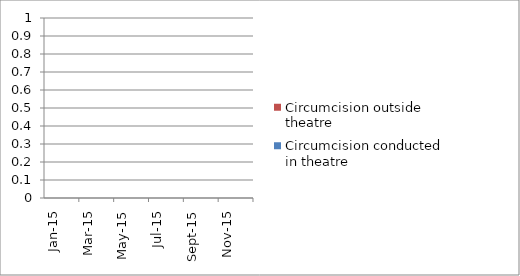
| Category | Circumcision conducted in theatre | Circumcision outside theatre |
|---|---|---|
| 2015-01-01 | 0 | 0 |
| 2015-02-01 | 0 | 0 |
| 2015-03-01 | 0 | 0 |
| 2015-04-01 | 0 | 0 |
| 2015-05-01 | 0 | 0 |
| 2015-06-01 | 0 | 0 |
| 2015-07-01 | 0 | 0 |
| 2015-08-01 | 0 | 0 |
| 2015-09-01 | 0 | 0 |
| 2015-10-01 | 0 | 0 |
| 2015-11-01 | 0 | 0 |
| 2015-12-01 | 0 | 0 |